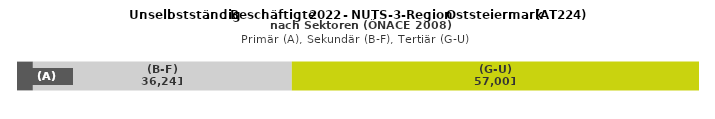
| Category | (A) | (B-F) | (G-U) |
|---|---|---|---|
| 0 | 2223 | 36241 | 57001 |